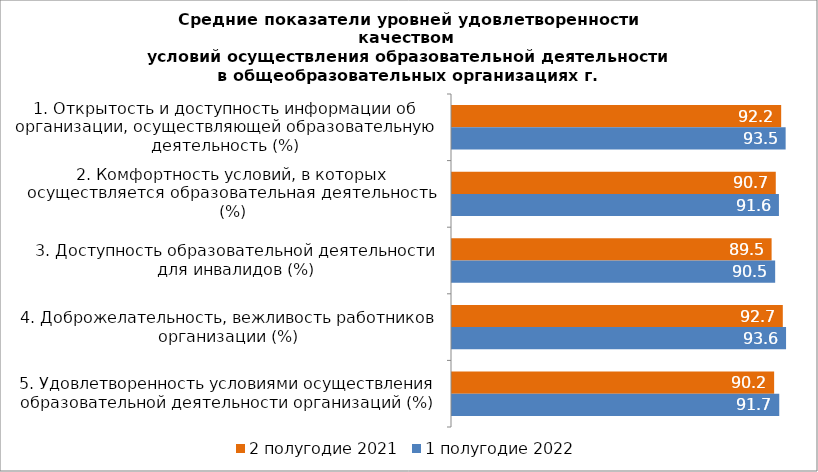
| Category | 2 полугодие 2021 | 1 полугодие 2022 |
|---|---|---|
| 1. Открытость и доступность информации об организации, осуществляющей образовательную деятельность (%) | 92.205 | 93.458 |
| 2. Комфортность условий, в которых осуществляется образовательная деятельность (%) | 90.694 | 91.577 |
| 3. Доступность образовательной деятельности для инвалидов (%) | 89.525 | 90.522 |
| 4. Доброжелательность, вежливость работников организации (%) | 92.661 | 93.573 |
| 5. Удовлетворенность условиями осуществления образовательной деятельности организаций (%) | 90.234 | 91.668 |